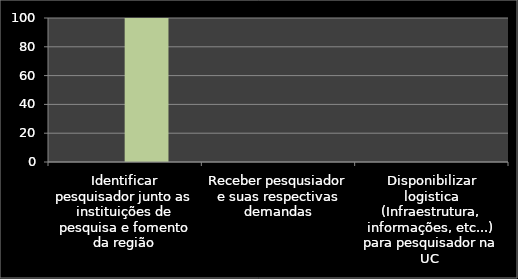
| Category | Inicio % | % |
|---|---|---|
| Identificar pesquisador junto as instituições de pesquisa e fomento da região | 0 | 100 |
| Receber pesqusiador e suas respectivas demandas | 0 | 0 |
| Disponibilizar logistica (Infraestrutura, informações, etc...) para pesquisador na UC  | 0 | 0 |